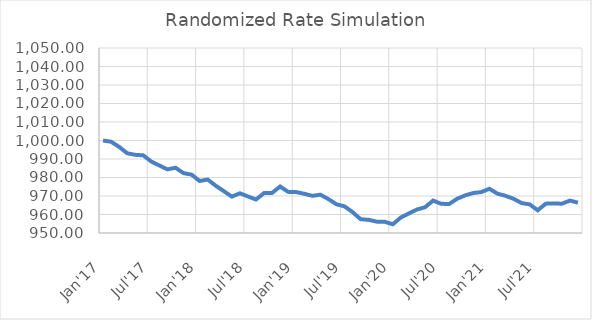
| Category | VALUE |
|---|---|
| 2017-01-01 | 1000 |
| 2017-02-01 | 999.336 |
| 2017-03-01 | 996.561 |
| 2017-04-01 | 993.114 |
| 2017-05-01 | 992.249 |
| 2017-06-01 | 991.984 |
| 2017-07-01 | 988.597 |
| 2017-08-01 | 986.493 |
| 2017-09-01 | 984.392 |
| 2017-10-01 | 985.273 |
| 2017-11-01 | 982.352 |
| 2017-12-01 | 981.551 |
| 2018-01-01 | 978.098 |
| 2018-02-01 | 978.894 |
| 2018-03-01 | 975.56 |
| 2018-04-01 | 972.644 |
| 2018-05-01 | 969.662 |
| 2018-06-01 | 971.472 |
| 2018-07-01 | 969.756 |
| 2018-08-01 | 968.097 |
| 2018-09-01 | 971.58 |
| 2018-10-01 | 971.645 |
| 2018-11-01 | 975.129 |
| 2018-12-01 | 972.228 |
| 2019-01-01 | 972.113 |
| 2019-02-01 | 971.198 |
| 2019-03-01 | 970.09 |
| 2019-04-01 | 970.697 |
| 2019-05-01 | 968.317 |
| 2019-06-01 | 965.533 |
| 2019-07-01 | 964.4 |
| 2019-08-01 | 961.305 |
| 2019-09-01 | 957.454 |
| 2019-10-01 | 957.102 |
| 2019-11-01 | 956.137 |
| 2019-12-01 | 956.049 |
| 2020-01-01 | 954.725 |
| 2020-02-01 | 958.425 |
| 2020-03-01 | 960.608 |
| 2020-04-01 | 962.693 |
| 2020-05-01 | 963.91 |
| 2020-06-01 | 967.514 |
| 2020-07-01 | 965.781 |
| 2020-08-01 | 965.673 |
| 2020-09-01 | 968.545 |
| 2020-10-01 | 970.355 |
| 2020-11-01 | 971.603 |
| 2020-12-01 | 972.128 |
| 2021-01-01 | 973.908 |
| 2021-02-01 | 971.25 |
| 2021-03-01 | 970.1 |
| 2021-04-01 | 968.492 |
| 2021-05-01 | 966.159 |
| 2021-06-01 | 965.48 |
| 2021-07-01 | 962.274 |
| 2021-08-01 | 965.867 |
| 2021-09-01 | 965.96 |
| 2021-10-01 | 965.841 |
| 2021-11-01 | 967.522 |
| 2021-12-01 | 966.375 |